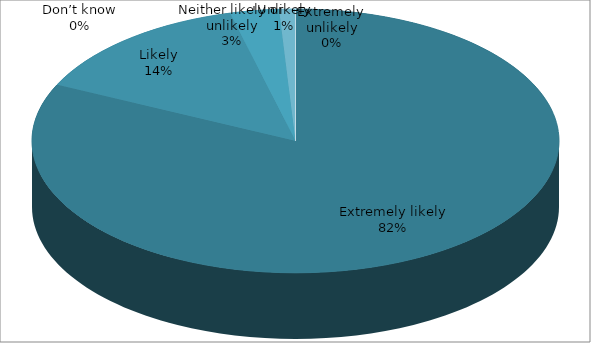
| Category | January | February | March |
|---|---|---|---|
| Extremely likely | 82 | 75 | 78 |
| Likely | 14 | 21 | 20 |
| Neither likely or unlikely | 3 | 2 | 0 |
| Unlikely | 1 | 0 | 0 |
| Extremely unlikely | 0 | 1 | 1 |
| Don’t know | 0 | 1 | 1 |